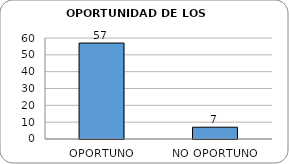
| Category | Series 0 |
|---|---|
| OPORTUNO | 57 |
| NO OPORTUNO | 7 |